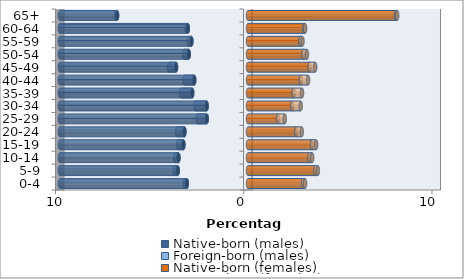
| Category | Native-born (males) | Foreign-born (males) | Native-born (females) | Foreign-born (females) |
|---|---|---|---|---|
| 0-4 | -3.248 | -0.117 | 2.933 | 0.099 |
| 5-9 | -3.732 | -0.164 | 3.584 | 0.127 |
| 10-14 | -3.693 | -0.178 | 3.271 | 0.139 |
| 15-19 | -3.428 | -0.281 | 3.404 | 0.216 |
| 20-24 | -3.376 | -0.394 | 2.575 | 0.281 |
| 25-29 | -2.187 | -0.493 | 1.597 | 0.36 |
| 30-34 | -2.195 | -0.592 | 2.359 | 0.443 |
| 35-39 | -2.961 | -0.588 | 2.432 | 0.439 |
| 40-44 | -2.854 | -0.511 | 2.806 | 0.388 |
| 45-49 | -3.821 | -0.376 | 3.279 | 0.291 |
| 50-54 | -3.147 | -0.239 | 2.949 | 0.186 |
| 55-59 | -3.006 | -0.133 | 2.792 | 0.105 |
| 60-64 | -3.196 | -0.059 | 2.994 | 0.042 |
| 65+ | -6.952 | -0.059 | 7.868 | 0.059 |